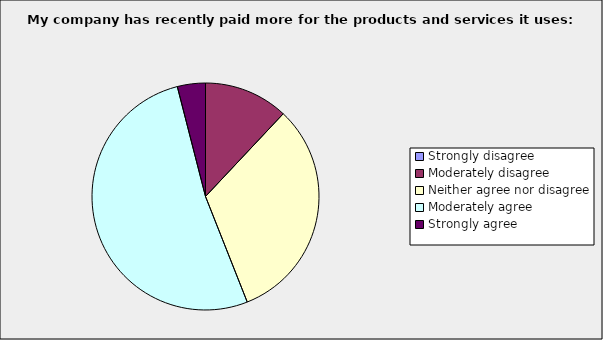
| Category | Series 0 |
|---|---|
| Strongly disagree | 0 |
| Moderately disagree | 0.12 |
| Neither agree nor disagree | 0.32 |
| Moderately agree | 0.52 |
| Strongly agree | 0.04 |